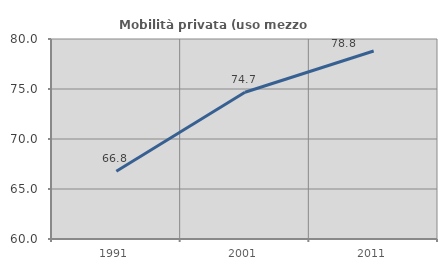
| Category | Mobilità privata (uso mezzo privato) |
|---|---|
| 1991.0 | 66.782 |
| 2001.0 | 74.678 |
| 2011.0 | 78.8 |